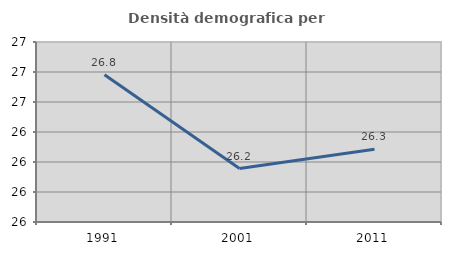
| Category | Densità demografica |
|---|---|
| 1991.0 | 26.782 |
| 2001.0 | 26.156 |
| 2011.0 | 26.285 |